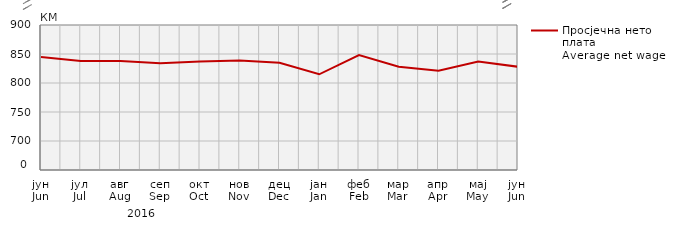
| Category | Просјечна нето плата
Average net wage |
|---|---|
| јун
Jun | 845 |
| јул
Jul | 838 |
| авг
Aug | 838 |
| сеп
Sep | 834 |
| окт
Oct | 837 |
| нов
Nov | 839 |
| дец
Dec | 835 |
| јан
Jan | 815 |
| феб
Feb | 848 |
| мар
Mar | 828 |
| апр
Apr | 821 |
| мај
May | 837 |
| јун
Jun | 828 |